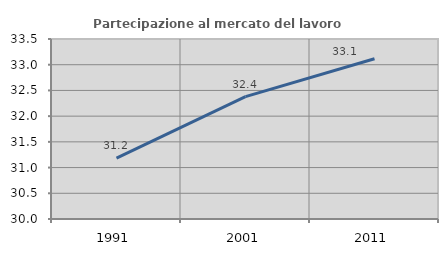
| Category | Partecipazione al mercato del lavoro  femminile |
|---|---|
| 1991.0 | 31.184 |
| 2001.0 | 32.379 |
| 2011.0 | 33.117 |